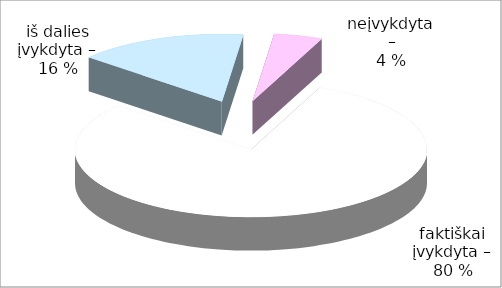
| Category | Series 0 |
|---|---|
| 0 | 36 |
| 1 | 7 |
| 2 | 2 |